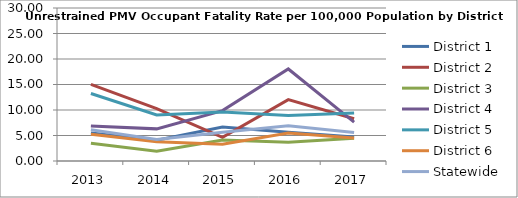
| Category | District 1 | District 2 | District 3 | District 4 | District 5 | District 6 | Statewide |
|---|---|---|---|---|---|---|---|
| 2013.0 | 5.516 | 15.011 | 3.46 | 6.883 | 13.242 | 5.224 | 6.141 |
| 2014.0 | 4.065 | 10.277 | 1.899 | 6.299 | 9.024 | 3.769 | 4.222 |
| 2015.0 | 6.666 | 4.656 | 4.135 | 9.876 | 9.614 | 3.269 | 5.62 |
| 2016.0 | 5.65 | 12.029 | 3.66 | 18.046 | 8.939 | 5.499 | 6.892 |
| 2017.0 | 4.684 | 8.293 | 4.459 | 7.625 | 9.42 | 4.501 | 5.591 |